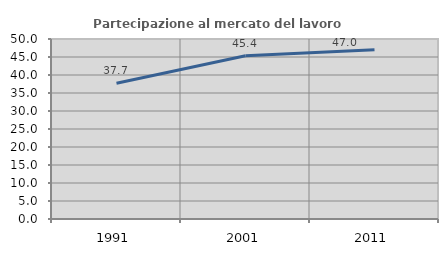
| Category | Partecipazione al mercato del lavoro  femminile |
|---|---|
| 1991.0 | 37.696 |
| 2001.0 | 45.361 |
| 2011.0 | 47.009 |